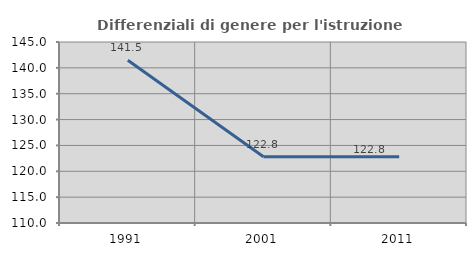
| Category | Differenziali di genere per l'istruzione superiore |
|---|---|
| 1991.0 | 141.483 |
| 2001.0 | 122.828 |
| 2011.0 | 122.82 |